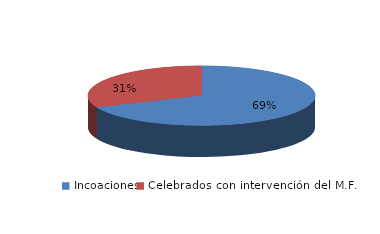
| Category | Series 0 |
|---|---|
| Incoaciones | 5328 |
| Celebrados con intervención del M.F. | 2439 |